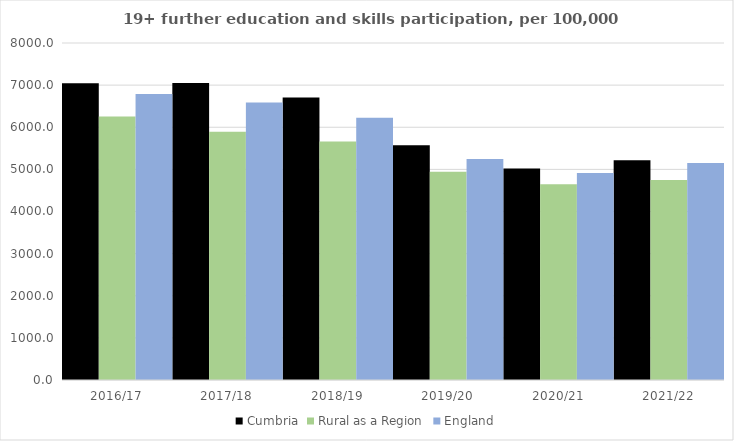
| Category | Cumbria | Rural as a Region | England |
|---|---|---|---|
| 2016/17 | 7042.217 | 6253.401 | 6788 |
| 2017/18 | 7049.998 | 5892.029 | 6588 |
| 2018/19 | 6705.699 | 5661.873 | 6227 |
| 2019/20 | 5570.422 | 4943.801 | 5244 |
| 2020/21 | 5021.688 | 4646.727 | 4913 |
| 2021/22 | 5218.992 | 4747.049 | 5151 |